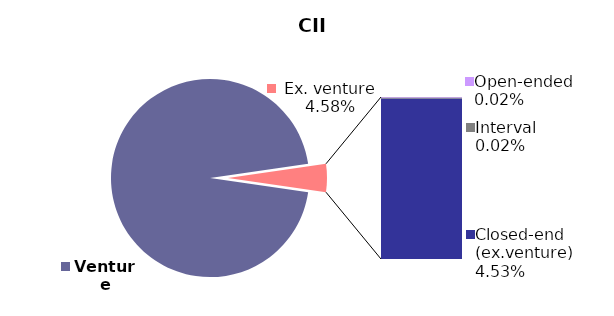
| Category | 31.03.2020 |
|---|---|
| Venture | 0.954 |
| Open-ended | 0 |
| Interval | 0 |
| Closed-end (ex.venture) | 0.045 |